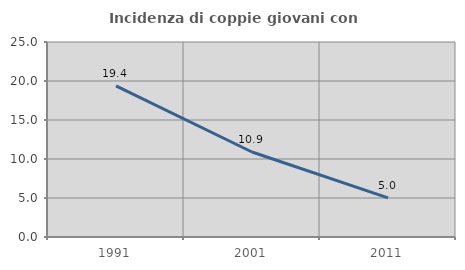
| Category | Incidenza di coppie giovani con figli |
|---|---|
| 1991.0 | 19.38 |
| 2001.0 | 10.897 |
| 2011.0 | 5.017 |